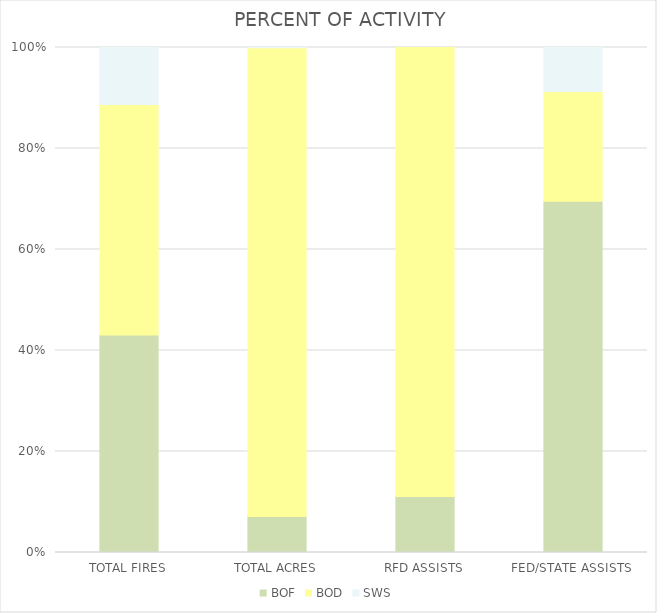
| Category | BOF | BOD | SWS |
|---|---|---|---|
| TOTAL FIRES | 84 | 89 | 22 |
| TOTAL ACRES | 622.72 | 8108.79 | 5.95 |
| RFD ASSISTS | 1 | 8 | 0 |
| FED/STATE ASSISTS | 32 | 10 | 4 |